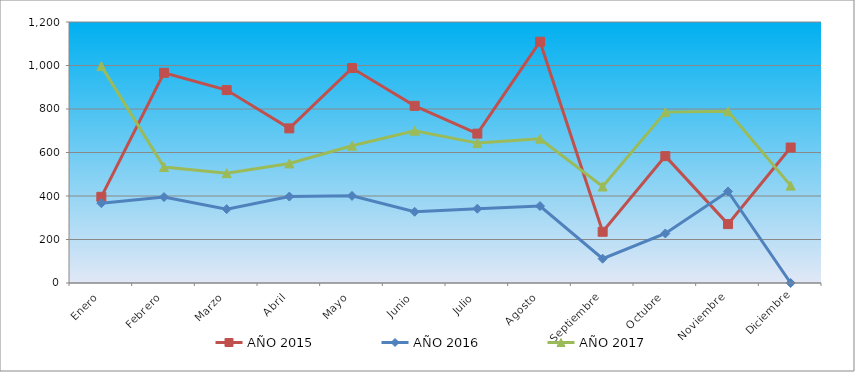
| Category | AÑO 2015 | AÑO 2016 | AÑO 2017 |
|---|---|---|---|
| Enero | 396.192 | 366.951 | 997.312 |
| Febrero | 966.269 | 395.178 | 533.257 |
| Marzo | 887.031 | 339.578 | 504.762 |
| Abril | 710.945 | 397.35 | 549.539 |
| Mayo | 988.28 | 400.58 | 630.952 |
| Junio | 814.396 | 327.378 | 700.154 |
| Julio | 686.734 | 341.612 | 643.164 |
| Agosto | 1109.339 | 353.812 | 663.518 |
| Septiembre | 235.514 | 111.837 | 443.702 |
| Octubre | 583.283 | 227.741 | 785.637 |
| Noviembre | 270.732 | 420.914 | 789.708 |
| Diciembre | 622.903 | 0 | 447.773 |